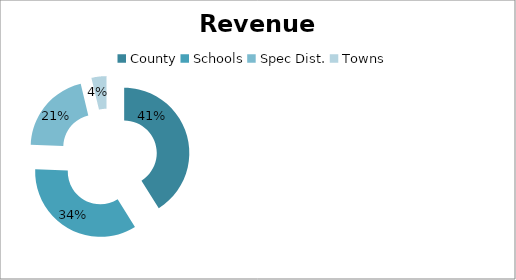
| Category | Series 0 |
|---|---|
| County | 0.411 |
| Schools | 0.345 |
| Spec Dist. | 0.207 |
| Towns | 0.037 |